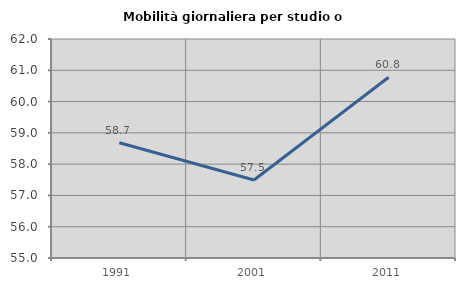
| Category | Mobilità giornaliera per studio o lavoro |
|---|---|
| 1991.0 | 58.684 |
| 2001.0 | 57.491 |
| 2011.0 | 60.777 |